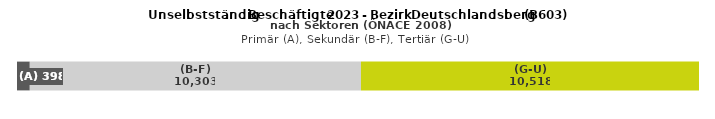
| Category | (A) | (B-F) | (G-U) |
|---|---|---|---|
| 0 | 398 | 10303 | 10518 |